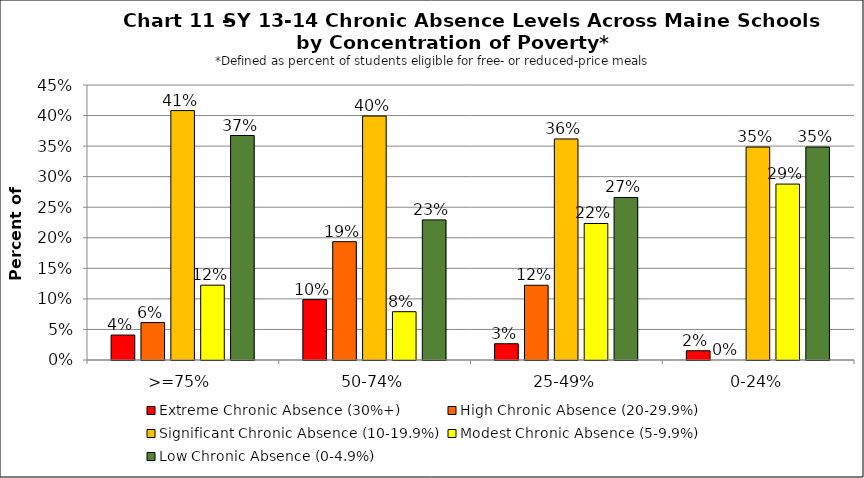
| Category | Extreme Chronic Absence (30%+) | High Chronic Absence (20-29.9%) | Significant Chronic Absence (10-19.9%) | Modest Chronic Absence (5-9.9%) | Low Chronic Absence (0-4.9%) |
|---|---|---|---|---|---|
| 0 | 0.041 | 0.061 | 0.408 | 0.122 | 0.367 |
| 1 | 0.099 | 0.194 | 0.399 | 0.079 | 0.229 |
| 2 | 0.027 | 0.122 | 0.362 | 0.223 | 0.266 |
| 3 | 0.015 | 0 | 0.348 | 0.288 | 0.348 |